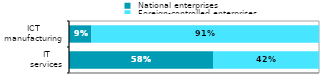
| Category |  National enterprises |  Foreign-controlled enterprises |
|---|---|---|
|  IT 
services | 0.576 | 0.424 |
|  ICT 
manufacturing | 0.09 | 0.91 |